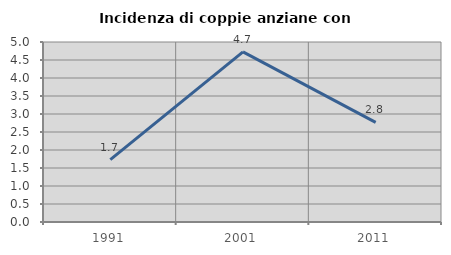
| Category | Incidenza di coppie anziane con figli |
|---|---|
| 1991.0 | 1.732 |
| 2001.0 | 4.724 |
| 2011.0 | 2.767 |